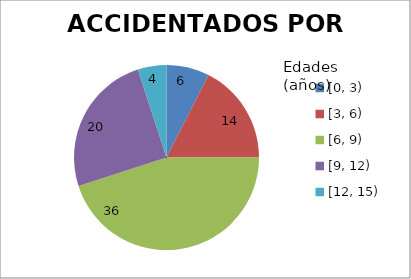
| Category | ACIDENTADOS POR EDADES |
|---|---|
| [0, 3) | 6 |
| [3, 6) | 14 |
| [6, 9) | 36 |
| [9, 12) | 20 |
| [12, 15) | 4 |